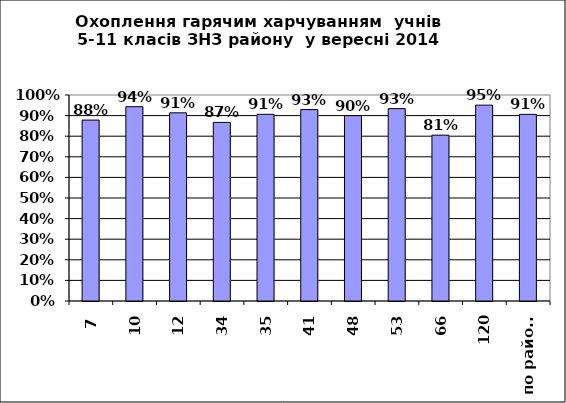
| Category | 88% 94% 91% 87% 91% 93% 90% 93% 81% 95% 91% |
|---|---|
| 7 | 0.878 |
| 10 | 0.943 |
| 12 | 0.913 |
| 34 | 0.867 |
| 35 | 0.906 |
| 41 | 0.929 |
| 48 | 0.9 |
| 53 | 0.934 |
| 66 | 0.805 |
| 120 | 0.951 |
| по району | 0.906 |